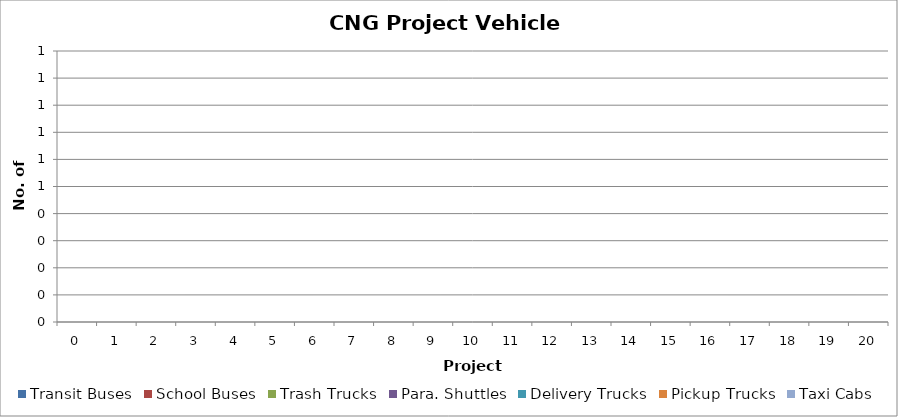
| Category | Transit Buses | School Buses | Trash Trucks | Para. Shuttles | Delivery Trucks | Pickup Trucks | Taxi Cabs |
|---|---|---|---|---|---|---|---|
| 0.0 | 0 | 0 | 0 | 0 | 0 | 0 | 0 |
| 1.0 | 0 | 0 | 0 | 0 | 0 | 0 | 0 |
| 2.0 | 0 | 0 | 0 | 0 | 0 | 0 | 0 |
| 3.0 | 0 | 0 | 0 | 0 | 0 | 0 | 0 |
| 4.0 | 0 | 0 | 0 | 0 | 0 | 0 | 0 |
| 5.0 | 0 | 0 | 0 | 0 | 0 | 0 | 0 |
| 6.0 | 0 | 0 | 0 | 0 | 0 | 0 | 0 |
| 7.0 | 0 | 0 | 0 | 0 | 0 | 0 | 0 |
| 8.0 | 0 | 0 | 0 | 0 | 0 | 0 | 0 |
| 9.0 | 0 | 0 | 0 | 0 | 0 | 0 | 0 |
| 10.0 | 0 | 0 | 0 | 0 | 0 | 0 | 0 |
| 11.0 | 0 | 0 | 0 | 0 | 0 | 0 | 0 |
| 12.0 | 0 | 0 | 0 | 0 | 0 | 0 | 0 |
| 13.0 | 0 | 0 | 0 | 0 | 0 | 0 | 0 |
| 14.0 | 0 | 0 | 0 | 0 | 0 | 0 | 0 |
| 15.0 | 0 | 0 | 0 | 0 | 0 | 0 | 0 |
| 16.0 | 0 | 0 | 0 | 0 | 0 | 0 | 0 |
| 17.0 | 0 | 0 | 0 | 0 | 0 | 0 | 0 |
| 18.0 | 0 | 0 | 0 | 0 | 0 | 0 | 0 |
| 19.0 | 0 | 0 | 0 | 0 | 0 | 0 | 0 |
| 20.0 | 0 | 0 | 0 | 0 | 0 | 0 | 0 |